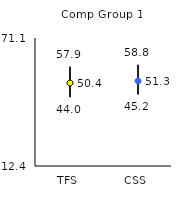
| Category | 25th | 75th | Mean |
|---|---|---|---|
| TFS | 44 | 57.9 | 50.44 |
| CSS | 45.2 | 58.8 | 51.33 |